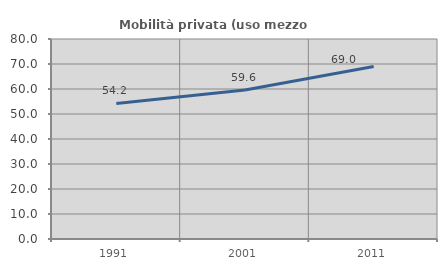
| Category | Mobilità privata (uso mezzo privato) |
|---|---|
| 1991.0 | 54.234 |
| 2001.0 | 59.607 |
| 2011.0 | 68.988 |